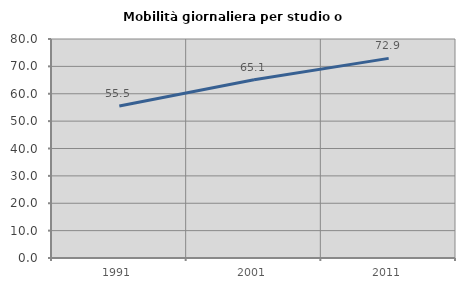
| Category | Mobilità giornaliera per studio o lavoro |
|---|---|
| 1991.0 | 55.497 |
| 2001.0 | 65.124 |
| 2011.0 | 72.927 |